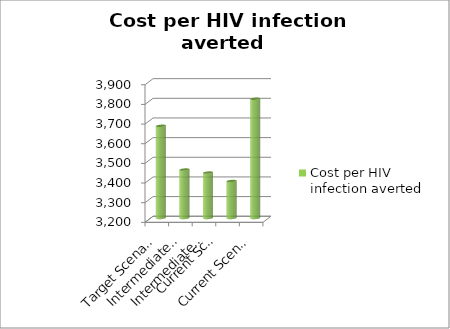
| Category | Cost per HIV infection averted |
|---|---|
| Target Scenario | 3669.144 |
| Intermediate Scenario 2 | 3446.528 |
| Intermediate Scenario 1 | 3431.178 |
| Current Scenario 
with ANC data | 3388.288 |
| Current Scenario without ANC data | 3806.679 |